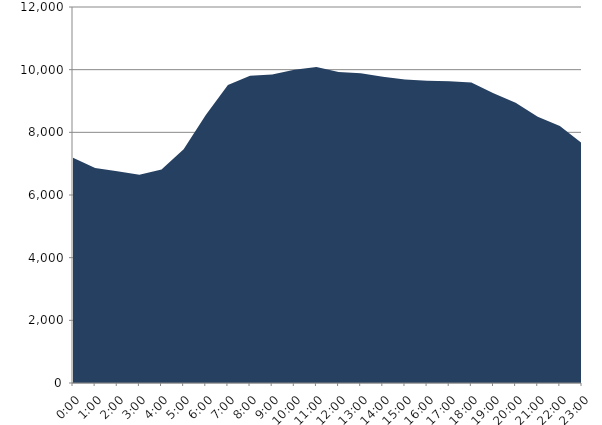
| Category | Series 0 | Series 1 |
|---|---|---|
| 2019-05-15 |  | 7187.06 |
| 2019-05-15 01:00:00 |  | 6857.92 |
| 2019-05-15 02:00:00 |  | 6754.24 |
| 2019-05-15 03:00:00 |  | 6644.13 |
| 2019-05-15 04:00:00 |  | 6811.4 |
| 2019-05-15 05:00:00 |  | 7463.97 |
| 2019-05-15 06:00:00 |  | 8556.36 |
| 2019-05-15 07:00:00 |  | 9508.13 |
| 2019-05-15 08:00:00 |  | 9807 |
| 2019-05-15 09:00:00 |  | 9846.92 |
| 2019-05-15 10:00:00 |  | 9995.49 |
| 2019-05-15 11:00:00 |  | 10082.04 |
| 2019-05-15 12:00:00 |  | 9925.25 |
| 2019-05-15 13:00:00 |  | 9887.45 |
| 2019-05-15 14:00:00 |  | 9777.64 |
| 2019-05-15 15:00:00 |  | 9689.56 |
| 2019-05-15 16:00:00 |  | 9644.92 |
| 2019-05-15 17:00:00 |  | 9630.43 |
| 2019-05-15 18:00:00 |  | 9590.67 |
| 2019-05-15 19:00:00 |  | 9249.66 |
| 2019-05-15 20:00:00 |  | 8944.23 |
| 2019-05-15 21:00:00 |  | 8494.18 |
| 2019-05-15 22:00:00 |  | 8203.29 |
| 2019-05-15 23:00:00 |  | 7651.46 |